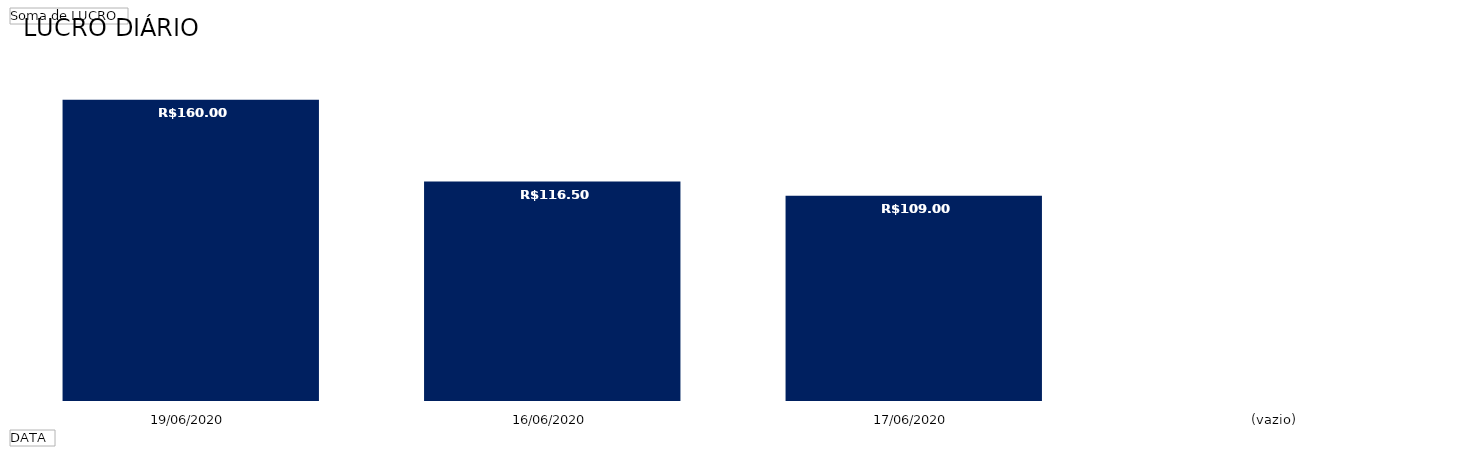
| Category | Total |
|---|---|
| 19/06/2020 | 160 |
| 16/06/2020 | 116.5 |
| 17/06/2020 | 109 |
| (vazio) | 0 |